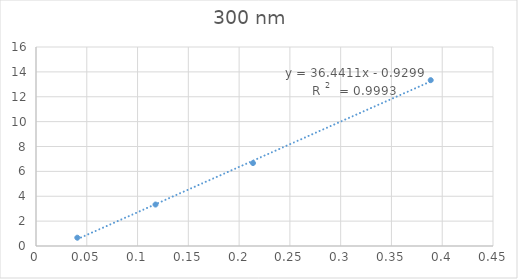
| Category | Series 0 |
|---|---|
| 0.04066666666666666 | 0.667 |
| 0.11766666666666667 | 3.333 |
| 0.21366666666666667 | 6.667 |
| 0.38866666666666666 | 13.333 |